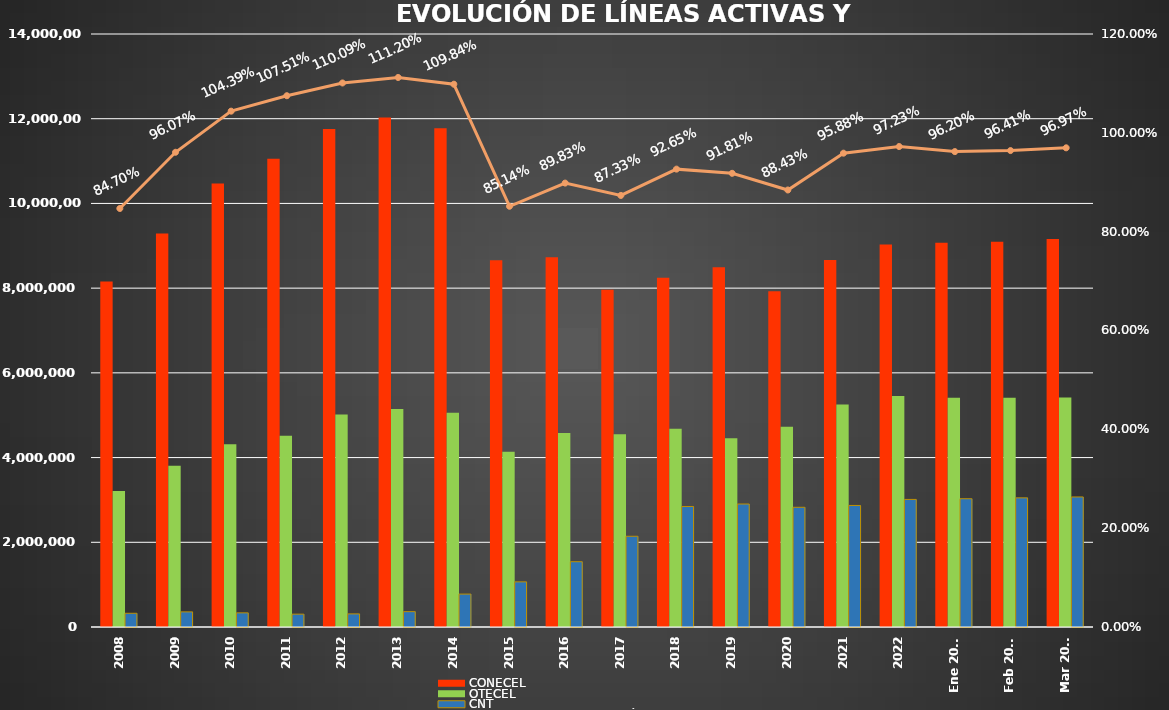
| Category | CONECEL | OTECEL | CNT |
|---|---|---|---|
| 2008 | 8156359 | 3211922 | 323967 |
| 2009 | 9291268 | 3806432 | 356900 |
| 2010 | 10470502 | 4314599 | 333730 |
| 2011 | 11057316 | 4513874 | 303368 |
| 2012 | 11757906 | 5019686 | 309271 |
| 2013 | 12030886 | 5148308 | 362560 |
| 2014 | 11772020 | 5055645 | 776892 |
| 2015 | 8658619 | 4134698 | 1065703 |
| 2016 | 8726823 | 4580092 | 1541219 |
| 2017 | 7960263 | 4549024 | 2142117 |
| 2018 | 8248050 | 4679646 | 2845142 |
| 2019 | 8493054 | 4456356 | 2903690 |
| 2020 | 7929253 | 4729725 | 2826388 |
| 2021 | 8665715 | 5254468 | 2869417 |
| 2022 | 9027737 | 5451115 | 3011899 |
| Ene 2023 | 9073421 | 5411860 | 3028254 |
| Feb 2023 | 9092490 | 5410682 | 3048837 |
| Mar 2023 | 9162562 | 5419670 | 3070611 |